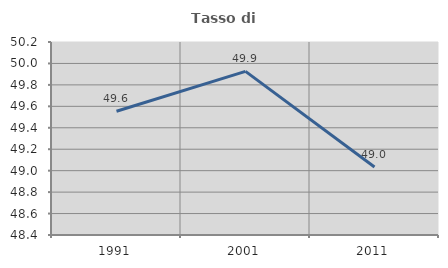
| Category | Tasso di occupazione   |
|---|---|
| 1991.0 | 49.554 |
| 2001.0 | 49.926 |
| 2011.0 | 49.035 |